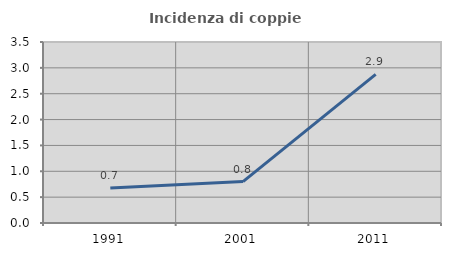
| Category | Incidenza di coppie miste |
|---|---|
| 1991.0 | 0.677 |
| 2001.0 | 0.802 |
| 2011.0 | 2.874 |